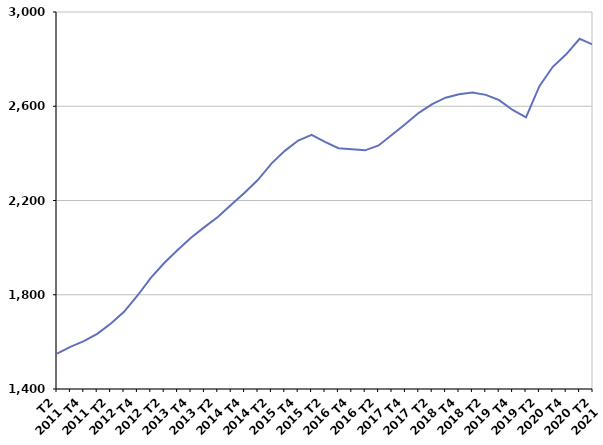
| Category | Inscrits depuis plus d'un an |
|---|---|
| T2
2011 | 1550.1 |
| T3
2011 | 1578.6 |
| T4
2011 | 1603.1 |
| T1
2012 | 1634 |
| T2
2012 | 1677.1 |
| T3
2012 | 1727.4 |
| T4
2012 | 1795.8 |
| T1
2013 | 1871.7 |
| T2
2013 | 1934.7 |
| T3
2013 | 1989.7 |
| T4
2013 | 2041.9 |
| T1
2014 | 2087 |
| T2
2014 | 2129.9 |
| T3
2014 | 2181.8 |
| T4
2014 | 2233.3 |
| T1
2015 | 2287.7 |
| T2
2015 | 2356.6 |
| T3
2015 | 2410.6 |
| T4
2015 | 2454.6 |
| T1
2016 | 2478.9 |
| T2
2016 | 2448.8 |
| T3
2016 | 2422.1 |
| T4
2016 | 2417.6 |
| T1
2017 | 2412.9 |
| T2
2017 | 2433.5 |
| T3
2017 | 2479.3 |
| T4
2017 | 2524.4 |
| T1
2018 | 2572.2 |
| T2
2018 | 2609.3 |
| T3
2018 | 2636.4 |
| T4
2018 | 2651.2 |
| T1
2019 | 2658.4 |
| T2
2019 | 2648.3 |
| T3
2019 | 2626.2 |
| T4
2019 | 2584.1 |
| T1
2020 | 2553.1 |
| T2
2020 | 2685.1 |
| T3
2020 | 2767.4 |
| T4
2020 | 2820.5 |
| T1
2021 | 2886.3 |
| T2
2021 | 2861.2 |